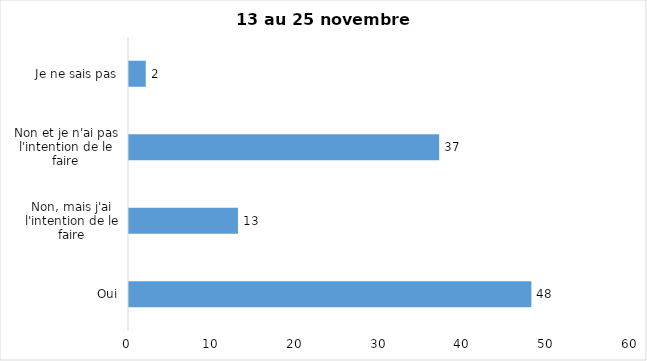
| Category | Series 0 |
|---|---|
| Oui | 48 |
| Non, mais j'ai l'intention de le faire | 13 |
| Non et je n'ai pas l'intention de le faire | 37 |
| Je ne sais pas | 2 |